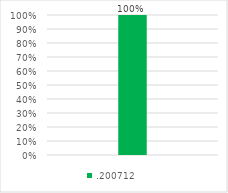
| Category | .200712 |
|---|---|
| 0 | 1 |